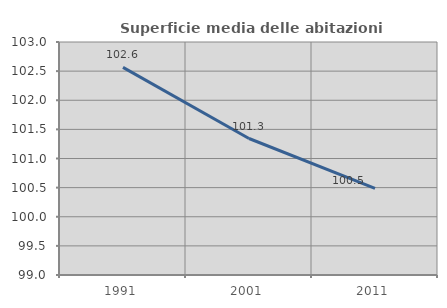
| Category | Superficie media delle abitazioni occupate |
|---|---|
| 1991.0 | 102.565 |
| 2001.0 | 101.343 |
| 2011.0 | 100.486 |